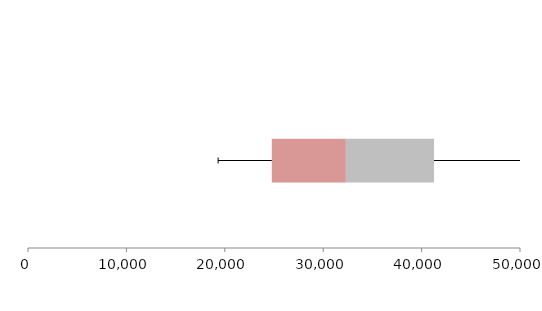
| Category | Series 1 | Series 2 | Series 3 |
|---|---|---|---|
| 0 | 24776.569 | 7526.644 | 8961.698 |